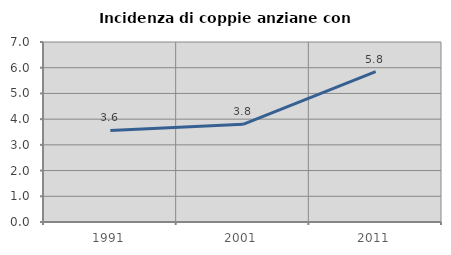
| Category | Incidenza di coppie anziane con figli |
|---|---|
| 1991.0 | 3.559 |
| 2001.0 | 3.797 |
| 2011.0 | 5.848 |